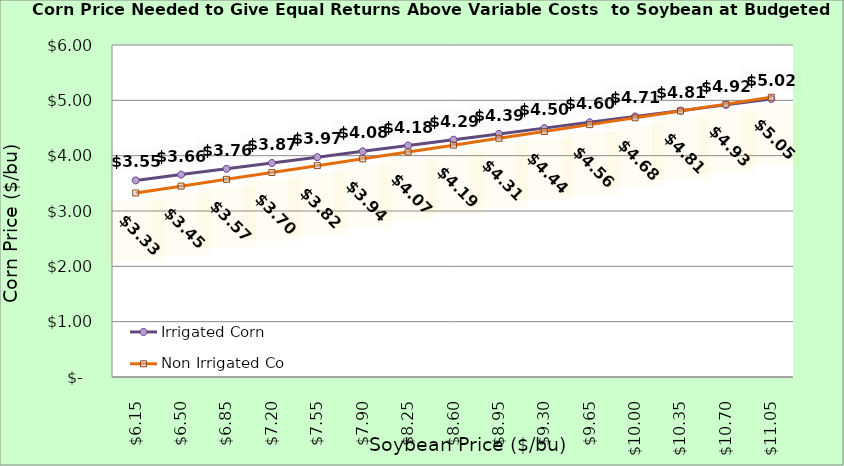
| Category | Irrigated Corn | Non Irrigated Corn |
|---|---|---|
| 6.150000000000002 | 3.553 | 3.325 |
| 6.500000000000002 | 3.658 | 3.449 |
| 6.850000000000001 | 3.763 | 3.573 |
| 7.200000000000001 | 3.868 | 3.696 |
| 7.550000000000001 | 3.973 | 3.82 |
| 7.9 | 4.078 | 3.943 |
| 8.25 | 4.183 | 4.067 |
| 8.6 | 4.288 | 4.19 |
| 8.95 | 4.393 | 4.314 |
| 9.299999999999999 | 4.498 | 4.437 |
| 9.649999999999999 | 4.603 | 4.561 |
| 9.999999999999998 | 4.708 | 4.684 |
| 10.349999999999998 | 4.813 | 4.808 |
| 10.699999999999998 | 4.918 | 4.931 |
| 11.049999999999997 | 5.023 | 5.055 |